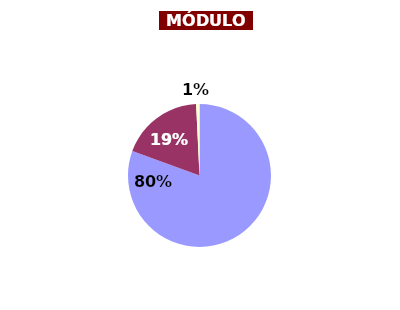
| Category | Series 0 |
|---|---|
| ÓTIMO | 80.557 |
| BOM | 18.688 |
| REGULAR | 0.755 |